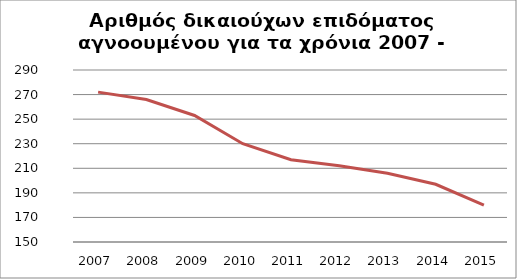
| Category | Series 1 |
|---|---|
| 2007.0 | 272 |
| 2008.0 | 266 |
| 2009.0 | 253 |
| 2010.0 | 230 |
| 2011.0 | 217 |
| 2012.0 | 212 |
| 2013.0 | 206 |
| 2014.0 | 197 |
| 2015.0 | 180 |